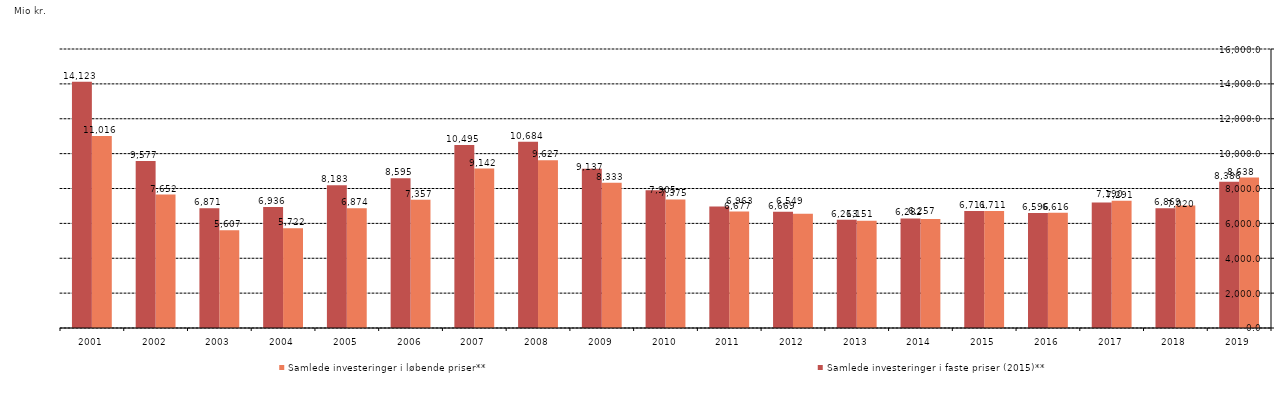
| Category | Samlede investeringer i løbende priser** | Samlede investeringer i faste priser (2015)** |
|---|---|---|
| 2019.0 | 8637.666 | 8386.083 |
| 2018.0 | 7020.034 | 6868.918 |
| 2017.0 | 7290.991 | 7190.326 |
| 2016.0 | 6615.644 | 6595.857 |
| 2015.0 | 6711.477 | 6711.477 |
| 2014.0 | 6256.567 | 6281.693 |
| 2013.0 | 6150.937 | 6213.068 |
| 2012.0 | 6548.757 | 6668.795 |
| 2011.0 | 6677.383 | 6962.861 |
| 2010.0 | 7375.125 | 7904.743 |
| 2009.0 | 8332.907 | 9136.96 |
| 2008.0 | 9626.581 | 10684.329 |
| 2007.0 | 9142 | 10494.834 |
| 2006.0 | 7357 | 8594.626 |
| 2005.0 | 6874 | 8183.333 |
| 2004.0 | 5722 | 6935.758 |
| 2003.0 | 5607 | 6871.324 |
| 2002.0 | 7652 | 9576.971 |
| 2001.0 | 11016 | 14123.077 |